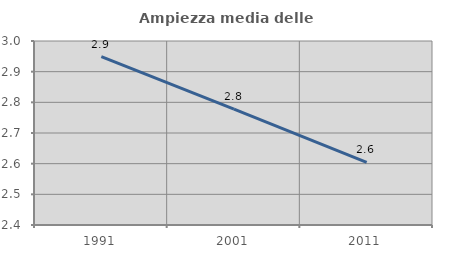
| Category | Ampiezza media delle famiglie |
|---|---|
| 1991.0 | 2.949 |
| 2001.0 | 2.778 |
| 2011.0 | 2.604 |